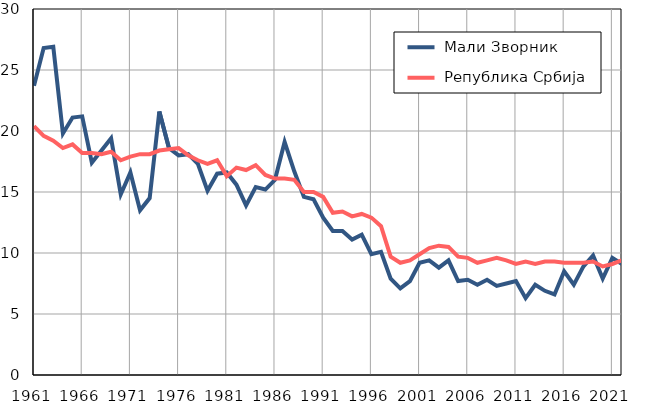
| Category |  Мали Зворник |  Република Србија |
|---|---|---|
| 1961.0 | 23.7 | 20.4 |
| 1962.0 | 26.8 | 19.6 |
| 1963.0 | 26.9 | 19.2 |
| 1964.0 | 19.8 | 18.6 |
| 1965.0 | 21.1 | 18.9 |
| 1966.0 | 21.2 | 18.2 |
| 1967.0 | 17.4 | 18.2 |
| 1968.0 | 18.4 | 18.1 |
| 1969.0 | 19.4 | 18.3 |
| 1970.0 | 14.8 | 17.6 |
| 1971.0 | 16.6 | 17.9 |
| 1972.0 | 13.5 | 18.1 |
| 1973.0 | 14.5 | 18.1 |
| 1974.0 | 21.6 | 18.4 |
| 1975.0 | 18.6 | 18.5 |
| 1976.0 | 18 | 18.6 |
| 1977.0 | 18.1 | 18 |
| 1978.0 | 17.3 | 17.6 |
| 1979.0 | 15.1 | 17.3 |
| 1980.0 | 16.5 | 17.6 |
| 1981.0 | 16.6 | 16.3 |
| 1982.0 | 15.6 | 17 |
| 1983.0 | 13.9 | 16.8 |
| 1984.0 | 15.4 | 17.2 |
| 1985.0 | 15.2 | 16.4 |
| 1986.0 | 16 | 16.1 |
| 1987.0 | 19.1 | 16.1 |
| 1988.0 | 16.7 | 16 |
| 1989.0 | 14.6 | 15 |
| 1990.0 | 14.4 | 15 |
| 1991.0 | 12.9 | 14.6 |
| 1992.0 | 11.8 | 13.3 |
| 1993.0 | 11.8 | 13.4 |
| 1994.0 | 11.1 | 13 |
| 1995.0 | 11.5 | 13.2 |
| 1996.0 | 9.9 | 12.9 |
| 1997.0 | 10.1 | 12.2 |
| 1998.0 | 7.9 | 9.7 |
| 1999.0 | 7.1 | 9.2 |
| 2000.0 | 7.7 | 9.4 |
| 2001.0 | 9.2 | 9.9 |
| 2002.0 | 9.4 | 10.4 |
| 2003.0 | 8.8 | 10.6 |
| 2004.0 | 9.4 | 10.5 |
| 2005.0 | 7.7 | 9.7 |
| 2006.0 | 7.8 | 9.6 |
| 2007.0 | 7.4 | 9.2 |
| 2008.0 | 7.8 | 9.4 |
| 2009.0 | 7.3 | 9.6 |
| 2010.0 | 7.5 | 9.4 |
| 2011.0 | 7.7 | 9.1 |
| 2012.0 | 6.3 | 9.3 |
| 2013.0 | 7.4 | 9.1 |
| 2014.0 | 6.9 | 9.3 |
| 2015.0 | 6.6 | 9.3 |
| 2016.0 | 8.5 | 9.2 |
| 2017.0 | 7.4 | 9.2 |
| 2018.0 | 8.9 | 9.2 |
| 2019.0 | 9.8 | 9.3 |
| 2020.0 | 7.9 | 8.9 |
| 2021.0 | 9.6 | 9.1 |
| 2022.0 | 9.1 | 9.4 |